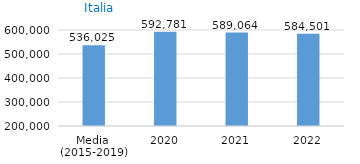
| Category | Series 0 |
|---|---|
| Media 
(2015-2019) | 536024.6 |
| 2020 | 592781 |
| 2021 | 589064 |
| 2022 | 584501 |